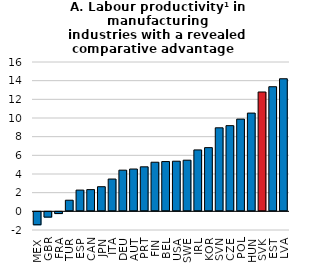
| Category | Manufacturing |
|---|---|
| MEX | -1.494 |
| GBR | -0.671 |
| FRA | -0.291 |
| TUR | 1.189 |
| ESP | 2.274 |
| CAN | 2.327 |
| JPN | 2.639 |
| ITA | 3.46 |
| DEU | 4.411 |
| AUT | 4.532 |
| PRT | 4.77 |
| FIN | 5.261 |
| BEL | 5.334 |
| USA | 5.37 |
| SWE | 5.478 |
| IRL | 6.579 |
| KOR | 6.825 |
| SVN | 8.949 |
| CZE | 9.18 |
| POL | 9.88 |
| HUN | 10.526 |
| SVK | 12.786 |
| EST | 13.35 |
| LVA | 14.204 |